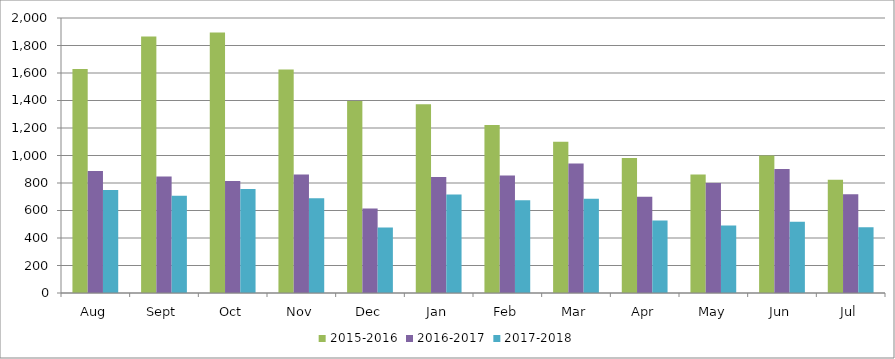
| Category | 2015-2016 | 2016-2017 | 2017-2018 |
|---|---|---|---|
| Aug | 1630 | 888 | 750 |
| Sept | 1865 | 847 | 708 |
| Oct | 1895 | 815 | 756 |
| Nov | 1626 | 861 | 690 |
| Dec | 1397 | 614 | 477 |
| Jan | 1373 | 843 | 716 |
| Feb | 1222 | 855 | 675 |
| Mar | 1100 | 942 | 686 |
| Apr | 981 | 700 | 527 |
| May | 861 | 800 | 491 |
| Jun | 1000 | 901 | 518 |
| Jul | 823 | 718 | 479 |